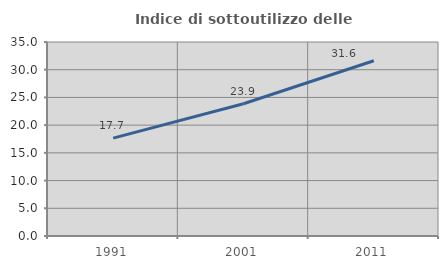
| Category | Indice di sottoutilizzo delle abitazioni  |
|---|---|
| 1991.0 | 17.658 |
| 2001.0 | 23.853 |
| 2011.0 | 31.626 |